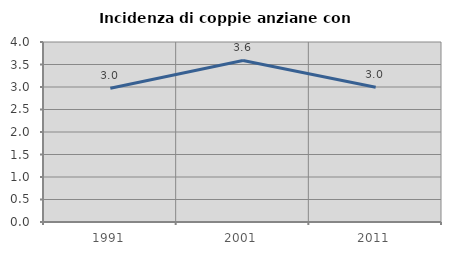
| Category | Incidenza di coppie anziane con figli |
|---|---|
| 1991.0 | 2.97 |
| 2001.0 | 3.59 |
| 2011.0 | 2.994 |